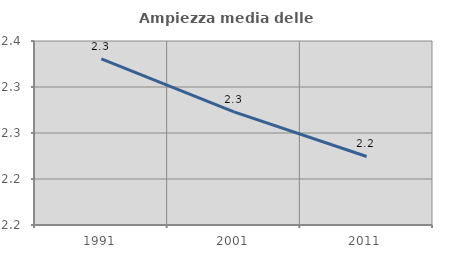
| Category | Ampiezza media delle famiglie |
|---|---|
| 1991.0 | 2.331 |
| 2001.0 | 2.273 |
| 2011.0 | 2.224 |